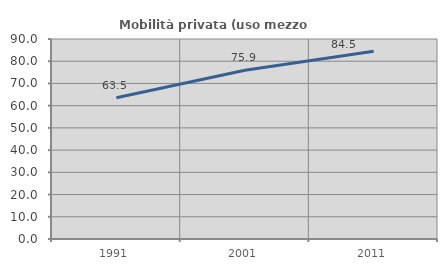
| Category | Mobilità privata (uso mezzo privato) |
|---|---|
| 1991.0 | 63.524 |
| 2001.0 | 75.93 |
| 2011.0 | 84.51 |